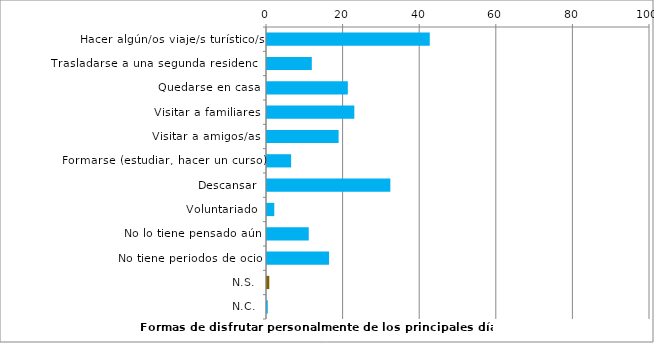
| Category | Series 0 |
|---|---|
| Hacer algún/os viaje/s turístico/s | 42.5 |
| Trasladarse a una segunda residencia | 11.7 |
| Quedarse en casa | 21.1 |
| Visitar a familiares | 22.8 |
| Visitar a amigos/as | 18.7 |
| Formarse (estudiar, hacer un curso) | 6.3 |
| Descansar | 32.2 |
| Voluntariado | 1.9 |
| No lo tiene pensado aún | 10.9 |
| No tiene periodos de ocio | 16.2 |
| N.S. | 0.6 |
| N.C. | 0.2 |